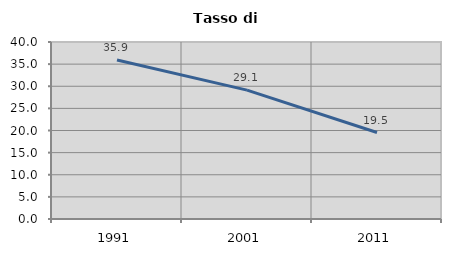
| Category | Tasso di disoccupazione   |
|---|---|
| 1991.0 | 35.915 |
| 2001.0 | 29.116 |
| 2011.0 | 19.543 |